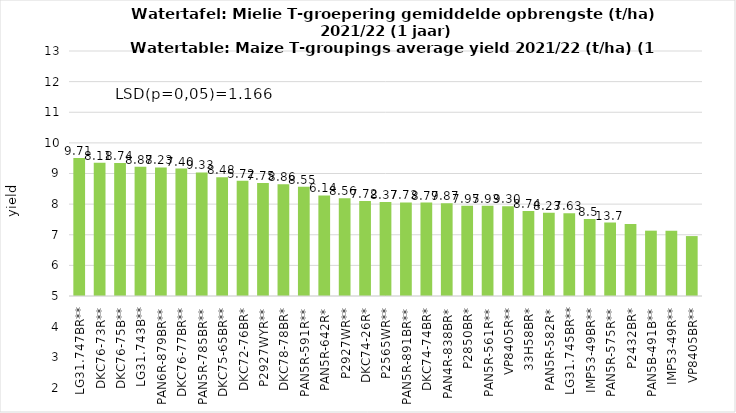
| Category | yield |
|---|---|
| LG31.747BR** | 9.502 |
| DKC76-73R** | 9.348 |
| DKC76-75B** | 9.342 |
| LG31.743B** | 9.221 |
| PAN6R-879BR** | 9.199 |
| DKC76-77BR** | 9.161 |
| PAN5R-785BR** | 9.034 |
| DKC75-65BR** | 8.88 |
| DKC72-76BR* | 8.76 |
| P2927WYR** | 8.691 |
| DKC78-78BR* | 8.652 |
| PAN5R-591R** | 8.57 |
| PAN5R-642R* | 8.282 |
| P2927WR** | 8.193 |
| DKC74-26R* | 8.1 |
| P2565WR** | 8.069 |
| PAN5R-891BR** | 8.056 |
| DKC74-74BR* | 8.05 |
| PAN4R-838BR* | 8.028 |
| P2850BR* | 7.949 |
| PAN5R-561R** | 7.944 |
| VP8405R** | 7.929 |
| 33H58BR* | 7.778 |
| PAN5R-582R* | 7.717 |
| LG31.745BR** | 7.7 |
| IMP53-49BR** | 7.517 |
| PAN5R-575R** | 7.4 |
| P2432BR* | 7.353 |
| PAN5B-491B** | 7.133 |
| IMP53-49R** | 7.131 |
| VP8405BR** | 6.957 |